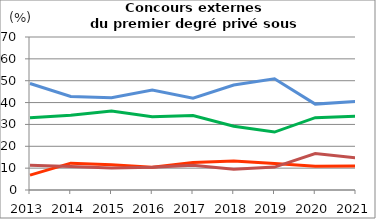
| Category | Étudiants | Enseignants et personnels d'éducation et de surveillance                            | Autres emplois dans secteurs public ou privé                | Sans emploi                    |
|---|---|---|---|---|
| 2013.0 | 48.736 | 33.103 | 6.782 | 11.379 |
| 2014.0 | 42.794 | 34.148 | 12.281 | 10.777 |
| 2015.0 | 42.2 | 36.1 | 11.6 | 10.1 |
| 2016.0 | 45.7 | 33.5 | 10.4 | 10.4 |
| 2017.0 | 42 | 34.1 | 12.6 | 11.3 |
| 2018.0 | 48 | 29.2 | 13.3 | 9.5 |
| 2019.0 | 50.9 | 26.5 | 12.1 | 10.5 |
| 2020.0 | 39.3 | 33.1 | 10.9 | 16.7 |
| 2021.0 | 40.5 | 33.8 | 11 | 14.7 |